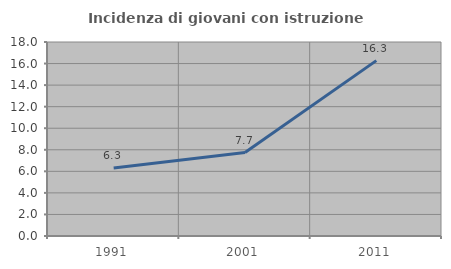
| Category | Incidenza di giovani con istruzione universitaria |
|---|---|
| 1991.0 | 6.303 |
| 2001.0 | 7.742 |
| 2011.0 | 16.271 |